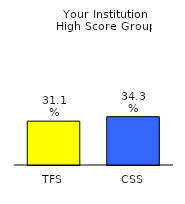
| Category | Series 0 |
|---|---|
| TFS | 0.311 |
| CSS | 0.343 |